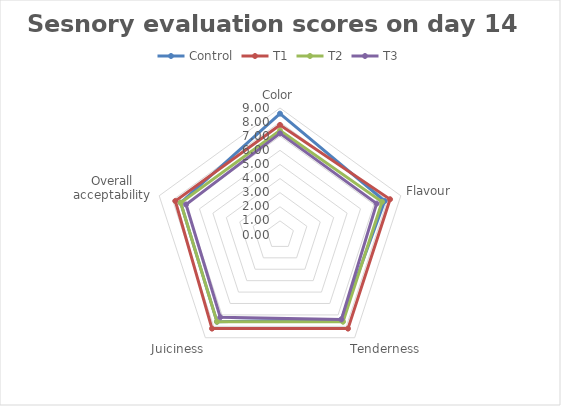
| Category | Control | T1 | T2 | T3 |
|---|---|---|---|---|
| Color | 8.6 | 7.8 | 7.4 | 7.2 |
| Flavour | 7.8 | 8.2 | 7.6 | 7.2 |
| Tenderness | 7.4 | 8.2 | 7.6 | 7.4 |
| Juiciness | 7.6 | 8.2 | 7.6 | 7.2 |
| Overall acceptability | 7.4 | 7.8 | 7.4 | 7 |